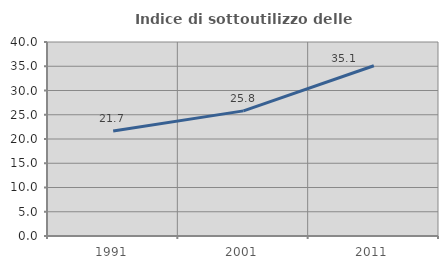
| Category | Indice di sottoutilizzo delle abitazioni  |
|---|---|
| 1991.0 | 21.656 |
| 2001.0 | 25.797 |
| 2011.0 | 35.104 |